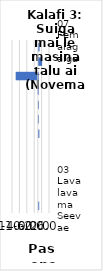
| Category | All items - m-m changes |
|---|---|
| 07 Femalagaiga | 0.346 |
| 01 Meaai ma Vaiinu | 1.725 |
| 04 Fale, Suavai, Eletise, Kesi ma isi | -12.016 |
| 05 Meafale, Mea Faigaleuga mo Faaleleia o Aiga | -0.211 |
| 12 Isi Oloa ma Auaunaga | 0.036 |
| 02 Ava Malosi ma Tapaa | -0.023 |
| 11 Faleaiga | 0.261 |
| 08 Fesootaiga | 0 |
| 09 Faafiafiaga ma Aganuu | 0 |
| 06 Soifua Maloloina | 0 |
| 10 Aoaoga | 0 |
| 03 Lavalava ma Seevae | 0.162 |